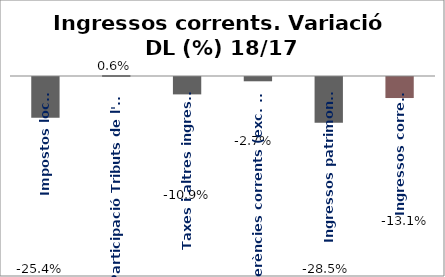
| Category | Series 0 |
|---|---|
| Impostos locals | -0.254 |
| Participació Tributs de l'Estat | 0.006 |
| Taxes i altres ingressos | -0.109 |
| Transferències corrents (exc. FCF) | -0.027 |
| Ingressos patrimonials | -0.285 |
| Ingressos corrents | -0.131 |